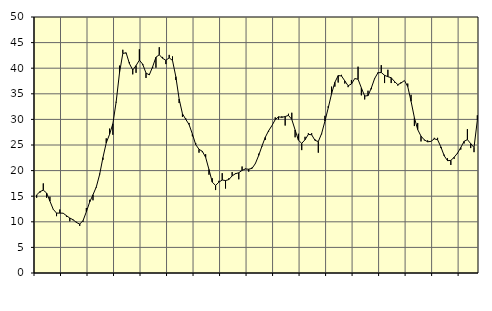
| Category | Piggar | Series 1 |
|---|---|---|
| nan | 14.7 | 15.26 |
| 87.0 | 15.7 | 15.89 |
| 87.0 | 17.5 | 16.18 |
| 87.0 | 14.7 | 15.63 |
| nan | 14.9 | 14.04 |
| 88.0 | 12.4 | 12.45 |
| 88.0 | 11.1 | 11.7 |
| 88.0 | 12.4 | 11.7 |
| nan | 11.7 | 11.68 |
| 89.0 | 11 | 11.19 |
| 89.0 | 10.1 | 10.74 |
| 89.0 | 10.3 | 10.4 |
| nan | 10 | 9.87 |
| 90.0 | 9.2 | 9.56 |
| 90.0 | 10 | 10.23 |
| 90.0 | 12.7 | 11.95 |
| nan | 14.3 | 13.85 |
| 91.0 | 14.2 | 15.28 |
| 91.0 | 16.7 | 16.81 |
| 91.0 | 19.4 | 19.22 |
| nan | 22.1 | 22.54 |
| 92.0 | 26.3 | 25.41 |
| 92.0 | 28.2 | 27.08 |
| 92.0 | 27 | 29.15 |
| nan | 33.3 | 33.45 |
| 93.0 | 40.5 | 39.08 |
| 93.0 | 43.6 | 42.88 |
| 93.0 | 42.9 | 43.01 |
| nan | 41.2 | 40.9 |
| 94.0 | 38.8 | 39.64 |
| 94.0 | 39.1 | 40.51 |
| 94.0 | 43.7 | 41.57 |
| nan | 40.6 | 40.79 |
| 95.0 | 38.1 | 39.05 |
| 95.0 | 38.9 | 38.7 |
| 95.0 | 40 | 40.28 |
| nan | 40.1 | 42.14 |
| 96.0 | 44.1 | 42.63 |
| 96.0 | 42.2 | 41.93 |
| 96.0 | 40.8 | 41.55 |
| nan | 42.6 | 42.02 |
| 97.0 | 42.3 | 41.51 |
| 97.0 | 37.7 | 38.35 |
| 97.0 | 33.2 | 33.99 |
| nan | 30.5 | 31.1 |
| 98.0 | 30.2 | 30.02 |
| 98.0 | 29.3 | 29 |
| 98.0 | 26.7 | 27.15 |
| nan | 25.4 | 25.08 |
| 99.0 | 23.5 | 24.16 |
| 99.0 | 23.6 | 23.77 |
| 99.0 | 23.2 | 22.59 |
| nan | 19.2 | 20.22 |
| 0.0 | 18.5 | 17.75 |
| 0.0 | 16.2 | 17.09 |
| 0.0 | 18 | 17.75 |
| nan | 19.5 | 18.16 |
| 1.0 | 16.5 | 18.06 |
| 1.0 | 18.5 | 18.25 |
| 1.0 | 19.7 | 18.97 |
| nan | 19.5 | 19.39 |
| 2.0 | 18.3 | 19.58 |
| 2.0 | 20.8 | 20.05 |
| 2.0 | 20.4 | 20.32 |
| nan | 19.8 | 20.27 |
| 3.0 | 20.6 | 20.44 |
| 3.0 | 21.3 | 21.36 |
| 3.0 | 23.3 | 22.95 |
| nan | 24.7 | 24.79 |
| 4.0 | 26 | 26.51 |
| 4.0 | 27.6 | 27.78 |
| 4.0 | 28.8 | 28.79 |
| nan | 30.4 | 29.95 |
| 5.0 | 30 | 30.51 |
| 5.0 | 30.6 | 30.4 |
| 5.0 | 28.8 | 30.56 |
| nan | 31.1 | 30.78 |
| 6.0 | 31.3 | 30 |
| 6.0 | 26.5 | 27.95 |
| 6.0 | 27.2 | 25.94 |
| nan | 24 | 25.32 |
| 7.0 | 26.6 | 26.03 |
| 7.0 | 27.3 | 27.07 |
| 7.0 | 27.3 | 27 |
| nan | 26.1 | 25.91 |
| 8.0 | 23.5 | 25.67 |
| 8.0 | 27.1 | 27.23 |
| 8.0 | 30.7 | 29.65 |
| nan | 32.6 | 32.25 |
| 9.0 | 36.4 | 35 |
| 9.0 | 36.4 | 37.24 |
| 9.0 | 37.2 | 38.56 |
| nan | 38.7 | 38.49 |
| 10.0 | 37 | 37.52 |
| 10.0 | 36.3 | 36.58 |
| 10.0 | 37.7 | 36.91 |
| nan | 38 | 37.97 |
| 11.0 | 40.3 | 37.85 |
| 11.0 | 34.7 | 36.15 |
| 11.0 | 33.9 | 34.57 |
| nan | 35.6 | 34.64 |
| 12.0 | 35.9 | 36.13 |
| 12.0 | 37.9 | 37.99 |
| 12.0 | 39.2 | 39.1 |
| nan | 40.6 | 39.16 |
| 13.0 | 37.1 | 38.61 |
| 13.0 | 39.7 | 38.34 |
| 13.0 | 37.1 | 38.14 |
| nan | 37.2 | 37.4 |
| 14.0 | 36.6 | 36.79 |
| 14.0 | 37.3 | 37.11 |
| 14.0 | 37.6 | 37.6 |
| nan | 37 | 36.4 |
| 15.0 | 34.8 | 33.53 |
| 15.0 | 28.7 | 30.34 |
| 15.0 | 29.3 | 28.01 |
| nan | 25.7 | 26.73 |
| 16.0 | 25.9 | 26 |
| 16.0 | 25.9 | 25.62 |
| 16.0 | 25.7 | 25.71 |
| nan | 26.4 | 26.2 |
| 17.0 | 26.4 | 26.04 |
| 17.0 | 24.4 | 24.62 |
| 17.0 | 23.1 | 22.89 |
| nan | 22.4 | 21.94 |
| 18.0 | 21.1 | 21.99 |
| 18.0 | 22.3 | 22.61 |
| 18.0 | 23.3 | 23.4 |
| nan | 24.1 | 24.5 |
| 19.0 | 25.3 | 25.72 |
| 19.0 | 28.1 | 26.05 |
| 19.0 | 24.4 | 25.27 |
| nan | 23.6 | 24.51 |
| 20.0 | 30.8 | 29.83 |